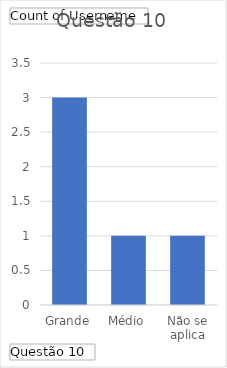
| Category | Total |
|---|---|
| Grande | 3 |
| Médio | 1 |
| Não se aplica | 1 |